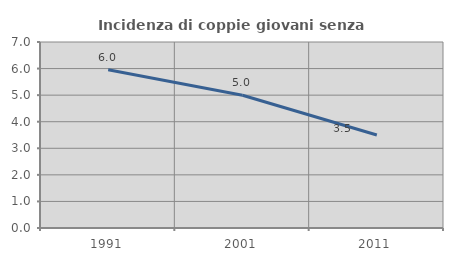
| Category | Incidenza di coppie giovani senza figli |
|---|---|
| 1991.0 | 5.953 |
| 2001.0 | 4.995 |
| 2011.0 | 3.498 |